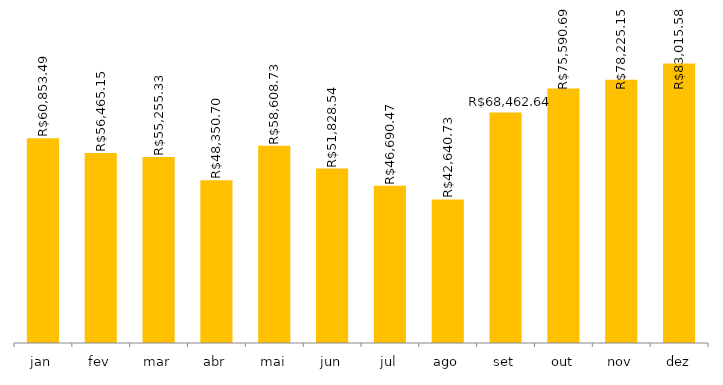
| Category | 2018 |
|---|---|
| jan | 60853.49 |
| fev | 56465.15 |
| mar | 55255.33 |
| abr | 48350.7 |
| mai | 58608.73 |
| jun | 51828.54 |
| jul | 46690.47 |
| ago | 42640.73 |
| set | 68462.64 |
| out | 75590.69 |
| nov | 78225.15 |
| dez | 83015.58 |